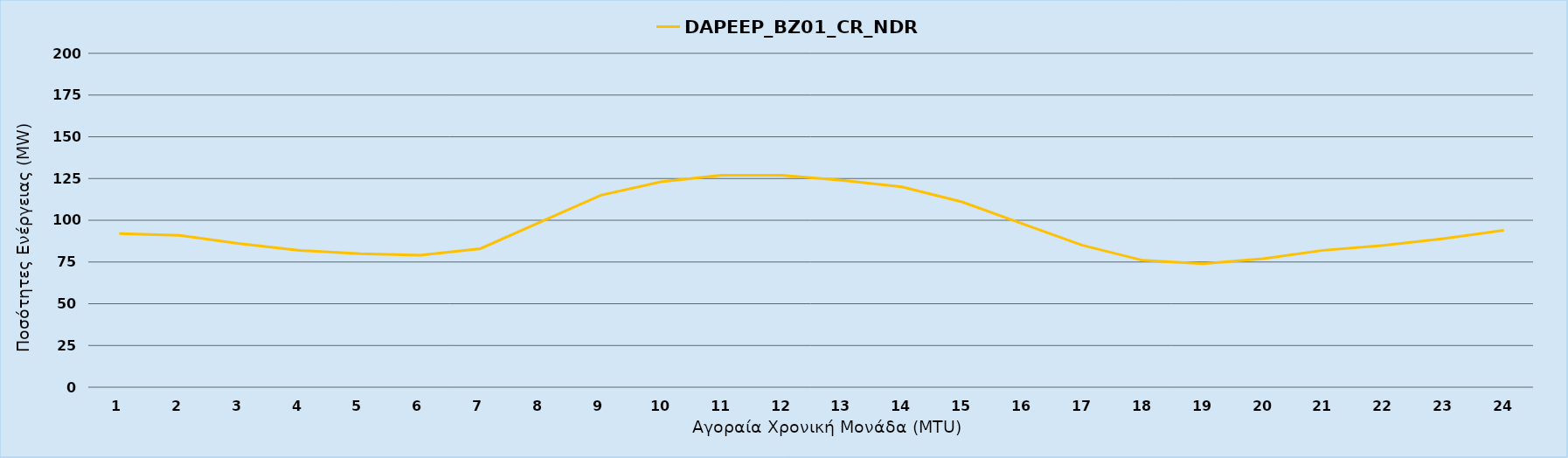
| Category | DAPEEP_BZ01_CR_NDR |
|---|---|
| 0 | 92 |
| 1 | 91 |
| 2 | 86 |
| 3 | 82 |
| 4 | 80 |
| 5 | 79 |
| 6 | 83 |
| 7 | 99 |
| 8 | 115 |
| 9 | 123 |
| 10 | 127 |
| 11 | 127 |
| 12 | 124 |
| 13 | 120 |
| 14 | 111 |
| 15 | 98 |
| 16 | 85 |
| 17 | 76 |
| 18 | 74 |
| 19 | 77 |
| 20 | 82 |
| 21 | 85 |
| 22 | 89 |
| 23 | 94 |